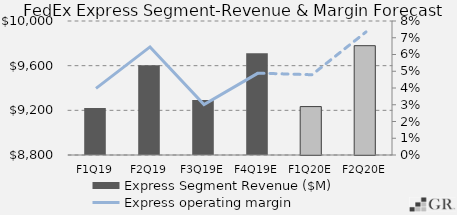
| Category | Express Segment Revenue ($M) |
|---|---|
|  F1Q19  | 9221.298 |
|  F2Q19  | 9603.601 |
|  F3Q19E  | 9291.632 |
|  F4Q19E  | 9711.356 |
|  F1Q20E  | 9233.561 |
|  F2Q20E  | 9778.994 |